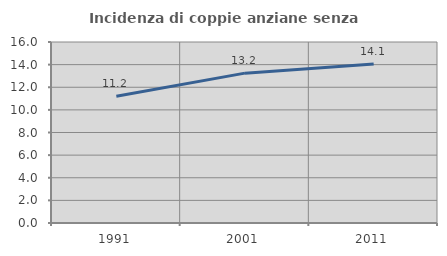
| Category | Incidenza di coppie anziane senza figli  |
|---|---|
| 1991.0 | 11.204 |
| 2001.0 | 13.247 |
| 2011.0 | 14.065 |